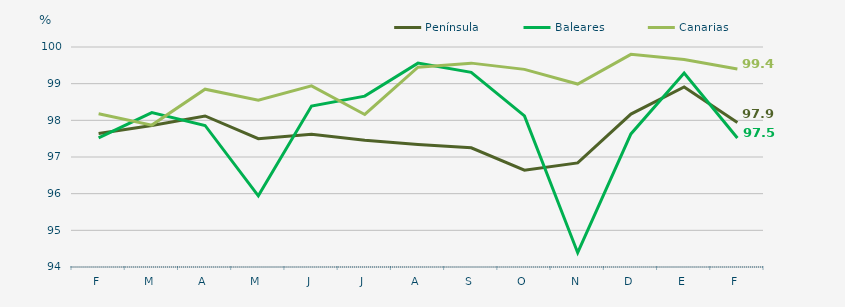
| Category | Península | Baleares | Canarias |
|---|---|---|---|
| F | 97.64 | 97.52 | 98.18 |
| M | 97.86 | 98.21 | 97.87 |
| A | 98.12 | 97.86 | 98.85 |
| M | 97.5 | 95.94 | 98.55 |
| J | 97.62 | 98.39 | 98.94 |
| J | 97.46 | 98.66 | 98.16 |
| A | 97.34 | 99.56 | 99.45 |
| S | 97.25 | 99.31 | 99.56 |
| O | 96.64 | 98.12 | 99.39 |
| N | 96.84 | 94.39 | 98.99 |
| D | 98.17 | 97.63 | 99.8 |
| E | 98.91 | 99.29 | 99.66 |
| F | 97.94 | 97.52 | 99.4 |